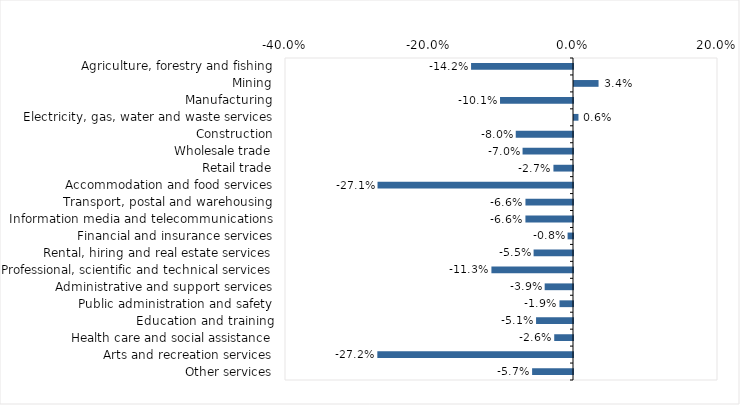
| Category | This week |
|---|---|
| Agriculture, forestry and fishing | -0.142 |
| Mining | 0.034 |
| Manufacturing | -0.101 |
| Electricity, gas, water and waste services | 0.006 |
| Construction | -0.08 |
| Wholesale trade | -0.07 |
| Retail trade | -0.027 |
| Accommodation and food services | -0.271 |
| Transport, postal and warehousing | -0.066 |
| Information media and telecommunications | -0.066 |
| Financial and insurance services | -0.008 |
| Rental, hiring and real estate services | -0.055 |
| Professional, scientific and technical services | -0.113 |
| Administrative and support services | -0.039 |
| Public administration and safety | -0.019 |
| Education and training | -0.051 |
| Health care and social assistance | -0.026 |
| Arts and recreation services | -0.272 |
| Other services | -0.057 |